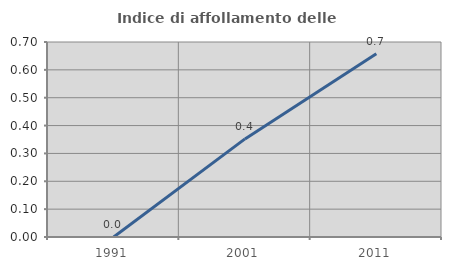
| Category | Indice di affollamento delle abitazioni  |
|---|---|
| 1991.0 | 0 |
| 2001.0 | 0.352 |
| 2011.0 | 0.658 |